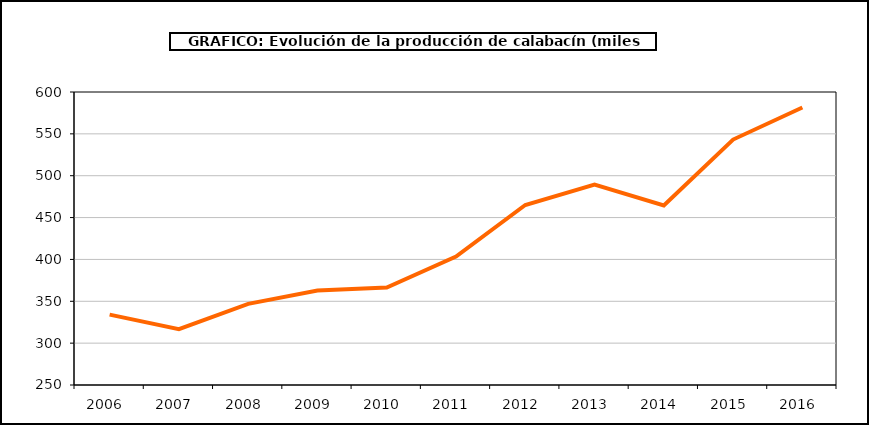
| Category | producción |
|---|---|
| 2006.0 | 334.043 |
| 2007.0 | 316.725 |
| 2008.0 | 346.959 |
| 2009.0 | 362.773 |
| 2010.0 | 366.498 |
| 2011.0 | 403.38 |
| 2012.0 | 465.039 |
| 2013.0 | 489.297 |
| 2014.0 | 464.496 |
| 2015.0 | 543.195 |
| 2016.0 | 581.503 |